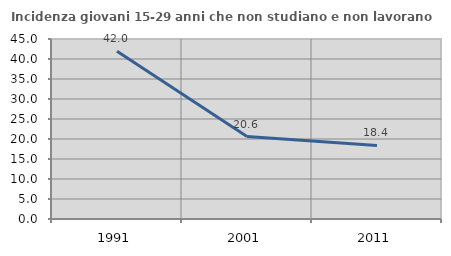
| Category | Incidenza giovani 15-29 anni che non studiano e non lavorano  |
|---|---|
| 1991.0 | 41.954 |
| 2001.0 | 20.611 |
| 2011.0 | 18.402 |